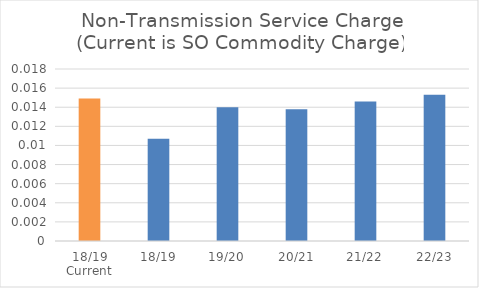
| Category | Series 0 |
|---|---|
| 18/19 Current | 0.015 |
| 18/19 | 0.011 |
| 19/20 | 0.014 |
| 20/21 | 0.014 |
| 21/22 | 0.015 |
| 22/23 | 0.015 |